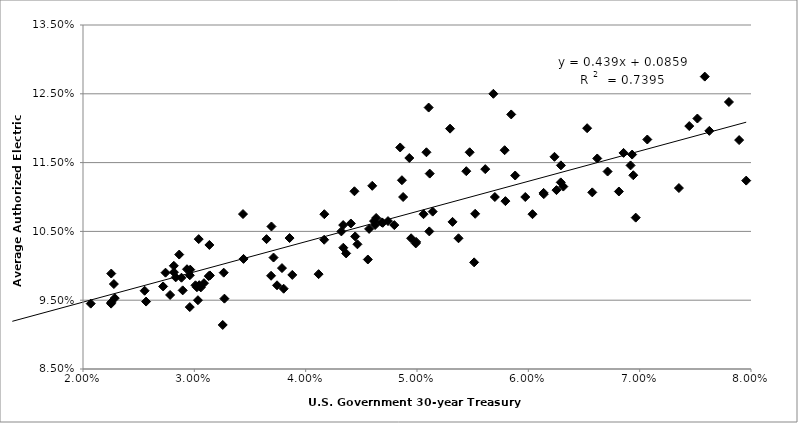
| Category | Series 0 |
|---|---|
| 0.07802062499999997 | 0.124 |
| 0.07893437499999999 | 0.118 |
| 0.07445446153846155 | 0.12 |
| 0.07518469696969694 | 0.121 |
| 0.07068396825396826 | 0.118 |
| 0.06855323076923074 | 0.116 |
| 0.06314272727272731 | 0.112 |
| 0.061389999999999986 | 0.11 |
| 0.06574515624999999 | 0.111 |
| 0.07352630769230767 | 0.111 |
| 0.07584772727272729 | 0.128 |
| 0.07956846153846153 | 0.112 |
| 0.0762572307692308 | 0.12 |
| 0.06942584615384617 | 0.113 |
| 0.06711861538461537 | 0.114 |
| 0.06234815384615382 | 0.116 |
| 0.06292569230769232 | 0.115 |
| 0.06918323076923079 | 0.115 |
| 0.06964469696969697 | 0.107 |
| 0.06619 | 0.116 |
| 0.06813328125000001 | 0.111 |
| 0.06932415384615384 | 0.116 |
| 0.06528166666666667 | 0.12 |
| 0.06137227272727274 | 0.111 |
| 0.05882015625000002 | 0.113 |
| 0.05846246153846155 | 0.122 |
| 0.05473196969696969 | 0.116 |
| 0.05104727272727275 | 0.123 |
| 0.05372968750000002 | 0.104 |
| 0.05794030769230768 | 0.109 |
| 0.060375606060606074 | 0.108 |
| 0.06252848484848486 | 0.111 |
| 0.06291261538461539 | 0.112 |
| 0.059723230769230765 | 0.11 |
| 0.05787187500000002 | 0.117 |
| 0.05686107692307691 | 0.125 |
| 0.054425937500000014 | 0.114 |
| 0.05699338461538464 | 0.11 |
| 0.05522562500000002 | 0.108 |
| 0.05297090909090909 | 0.12 |
| 0.0551321875 | 0.1 |
| 0.05612915384615385 | 0.114 |
| 0.0508485909090909 | 0.116 |
| 0.049307318181818195 | 0.116 |
| 0.048490953125 | 0.117 |
| 0.04597904615384617 | 0.112 |
| 0.051104863636363636 | 0.105 |
| 0.051142196969696976 | 0.113 |
| 0.048753138461538476 | 0.11 |
| 0.05319286153846153 | 0.106 |
| 0.05058801515151515 | 0.108 |
| 0.04864845454545455 | 0.112 |
| 0.046927312499999985 | 0.106 |
| 0.04465093846153847 | 0.103 |
| 0.044381742424242414 | 0.111 |
| 0.046829078125 | 0.106 |
| 0.04633183076923076 | 0.107 |
| 0.05140650769230769 | 0.108 |
| 0.0499256923076923 | 0.103 |
| 0.04739560000000001 | 0.106 |
| 0.047964107692307696 | 0.106 |
| 0.049891384615384615 | 0.103 |
| 0.04947043076923079 | 0.104 |
| 0.046137848484848476 | 0.106 |
| 0.044057984615384606 | 0.106 |
| 0.045697861538461525 | 0.105 |
| 0.04444857575757576 | 0.104 |
| 0.03648545454545455 | 0.104 |
| 0.034371828125000004 | 0.108 |
| 0.04167533846153845 | 0.108 |
| 0.043207924242424235 | 0.105 |
| 0.043369 | 0.106 |
| 0.04623328125000001 | 0.106 |
| 0.04363555384615385 | 0.102 |
| 0.03855463636363636 | 0.104 |
| 0.041662787878787896 | 0.104 |
| 0.04558379687499998 | 0.101 |
| 0.043380446153846154 | 0.103 |
| 0.03692825757575758 | 0.106 |
| 0.03039281538461539 | 0.104 |
| 0.03135133846153847 | 0.103 |
| 0.029340830769230764 | 0.1 |
| 0.02741293846153846 | 0.099 |
| 0.028642166666666666 | 0.102 |
| 0.031295609375 | 0.098 |
| 0.031398800000000004 | 0.099 |
| 0.0371136212121212 | 0.101 |
| 0.03787227272727271 | 0.1 |
| 0.03689290624999999 | 0.099 |
| 0.034420169230769224 | 0.101 |
| 0.032637651515151515 | 0.099 |
| 0.029634439393939404 | 0.099 |
| 0.025536187500000005 | 0.096 |
| 0.028846923076923076 | 0.098 |
| 0.029591227272727273 | 0.094 |
| 0.029592590909090898 | 0.099 |
| 0.0271972 | 0.097 |
| 0.025666046153846152 | 0.095 |
| 0.022773333333333333 | 0.097 |
| 0.028326507692307684 | 0.098 |
| 0.030435492307692304 | 0.097 |
| 0.02895535384615384 | 0.096 |
| 0.028157476923076918 | 0.1 |
| 0.028170630769230768 | 0.099 |
| 0.030233969230769233 | 0.097 |
| 0.030863630769230772 | 0.097 |
| 0.030584523076923074 | 0.097 |
| 0.03270189393939394 | 0.095 |
| 0.030102703124999998 | 0.097 |
| 0.027823599999999997 | 0.096 |
| 0.02285531818181818 | 0.095 |
| 0.02253839393939394 | 0.099 |
| 0.018880323076923073 | 0.097 |
| 0.013756846153846161 | 0.096 |
| 0.013650969696969693 | 0.093 |
| 0.016167287878787885 | 0.096 |
| 0.020693546875000003 | 0.094 |
| 0.02253638461538462 | 0.095 |
| 0.019311075757575756 | 0.093 |
| 0.01943701515151515 | 0.097 |
| 0.022523281249999996 | 0.095 |
| 0.030324123076923084 | 0.095 |
| 0.0325509393939394 | 0.091 |
| 0.03879798461538462 | 0.099 |
| 0.03742836923076922 | 0.097 |
| 0.03802336923076923 | 0.097 |
| 0.041161818181818174 | 0.099 |